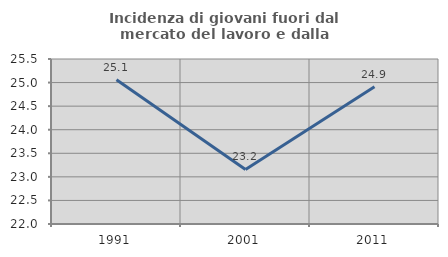
| Category | Incidenza di giovani fuori dal mercato del lavoro e dalla formazione  |
|---|---|
| 1991.0 | 25.06 |
| 2001.0 | 23.156 |
| 2011.0 | 24.911 |